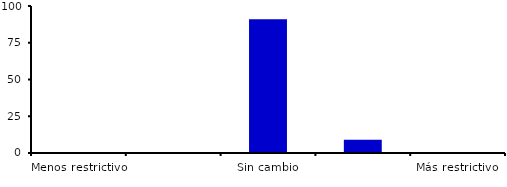
| Category | Series 0 |
|---|---|
| Menos restrictivo | 0 |
| Moderadamente menos restrictivo | 0 |
| Sin cambio | 90.909 |
| Moderadamente más restrictivo | 9.091 |
| Más restrictivo | 0 |